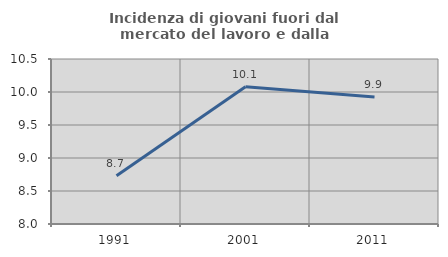
| Category | Incidenza di giovani fuori dal mercato del lavoro e dalla formazione  |
|---|---|
| 1991.0 | 8.731 |
| 2001.0 | 10.081 |
| 2011.0 | 9.924 |